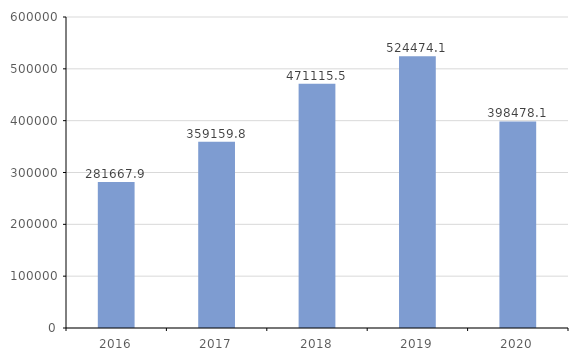
| Category | Series 0 |
|---|---|
| 2016.0 | 281667.9 |
| 2017.0 | 359159.8 |
| 2018.0 | 471115.5 |
| 2019.0 | 524474.1 |
| 2020.0 | 398478.1 |